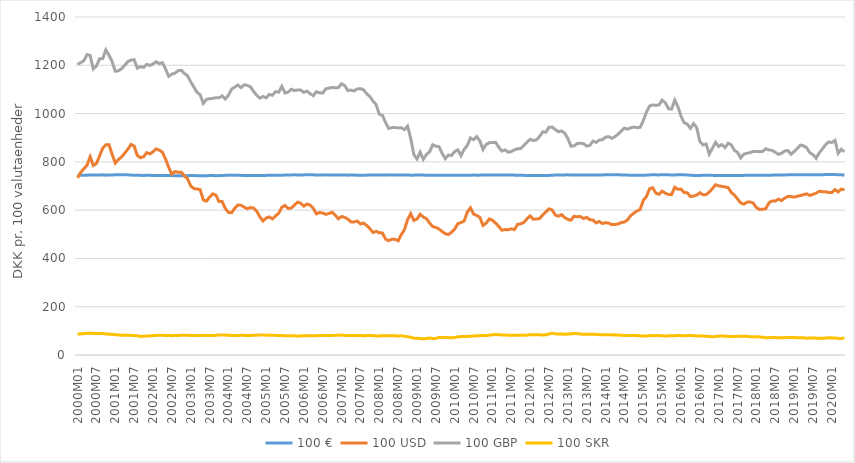
| Category | 100 € | 100 USD | 100 GBP | 100 SKR |
|---|---|---|---|---|
| 2000M01 | 744.399 | 733.583 | 1203.584 | 86.577 |
| 2000M02 | 744.528 | 756.235 | 1211.206 | 87.478 |
| 2000M03 | 744.74 | 771.574 | 1218.889 | 88.74 |
| 2000M04 | 745.025 | 785.645 | 1244.331 | 90.124 |
| 2000M05 | 745.682 | 820.972 | 1240.706 | 90.496 |
| 2000M06 | 746.01 | 785.108 | 1184.871 | 89.744 |
| 2000M07 | 745.88 | 793.219 | 1196.805 | 88.708 |
| 2000M08 | 745.776 | 824.039 | 1227.002 | 88.854 |
| 2000M09 | 746.231 | 856.511 | 1227.985 | 88.696 |
| 2000M10 | 744.733 | 870.721 | 1264.013 | 87.368 |
| 2000M11 | 745.671 | 870.685 | 1241.532 | 86.42 |
| 2000M12 | 745.78 | 831.13 | 1214.954 | 86.106 |
| 2001M01 | 746.437 | 795.062 | 1175.57 | 83.884 |
| 2001M02 | 746.312 | 809.493 | 1176.835 | 83.174 |
| 2001M03 | 746.439 | 820.677 | 1186.094 | 81.772 |
| 2001M04 | 746.324 | 835.922 | 1199.776 | 81.889 |
| 2001M05 | 746.163 | 852.52 | 1215.663 | 82.334 |
| 2001M06 | 745.373 | 872.19 | 1221.512 | 81.013 |
| 2001M07 | 744.489 | 865.706 | 1223.295 | 80.41 |
| 2001M08 | 744.517 | 826.772 | 1187.89 | 80.001 |
| 2001M09 | 744.138 | 817.05 | 1194.541 | 76.928 |
| 2001M10 | 743.669 | 820.787 | 1191.443 | 77.647 |
| 2001M11 | 744.527 | 838.099 | 1203.92 | 79.118 |
| 2001M12 | 744.327 | 833.059 | 1199.589 | 78.974 |
| 2002M01 | 743.287 | 841.677 | 1205.53 | 80.552 |
| 2002M02 | 742.988 | 853.996 | 1214.844 | 80.914 |
| 2002M03 | 743.232 | 848.49 | 1206.817 | 82.027 |
| 2002M04 | 743.41 | 839.81 | 1211 | 81.42 |
| 2002M05 | 743.538 | 811.306 | 1184.193 | 80.664 |
| 2002M06 | 743.298 | 777.475 | 1154.035 | 81.567 |
| 2002M07 | 743.01 | 748.969 | 1163.403 | 80.178 |
| 2002M08 | 742.698 | 759.618 | 1167.209 | 80.31 |
| 2002M09 | 742.71 | 757.302 | 1177.83 | 81.018 |
| 2002M10 | 742.97 | 757.296 | 1179.439 | 81.6 |
| 2002M11 | 742.795 | 741.821 | 1165.94 | 81.79 |
| 2002M12 | 742.623 | 729.936 | 1156.821 | 81.642 |
| 2003M01 | 743.243 | 699.871 | 1131.145 | 81.026 |
| 2003M02 | 743.166 | 689.86 | 1109.811 | 81.262 |
| 2003M03 | 742.739 | 687.471 | 1088.249 | 80.502 |
| 2003M04 | 742.555 | 684.89 | 1077.956 | 81.123 |
| 2003M05 | 742.462 | 642.658 | 1042.058 | 81.108 |
| 2003M06 | 742.505 | 637.227 | 1058.777 | 81.436 |
| 2003M07 | 743.318 | 653.704 | 1061.332 | 80.924 |
| 2003M08 | 743.22 | 667.438 | 1063.033 | 80.454 |
| 2003M09 | 742.729 | 662.166 | 1065.77 | 81.913 |
| 2003M10 | 743.011 | 635.512 | 1065.149 | 82.462 |
| 2003M11 | 743.704 | 635.692 | 1073.587 | 82.69 |
| 2003M12 | 744.17 | 607.03 | 1060.359 | 82.542 |
| 2004M01 | 744.811 | 590.553 | 1076.153 | 81.52 |
| 2004M02 | 745.112 | 589.249 | 1100.848 | 81.202 |
| 2004M03 | 744.93 | 607.564 | 1109.847 | 80.668 |
| 2004M04 | 744.346 | 621.429 | 1118.363 | 81.214 |
| 2004M05 | 744.057 | 620.236 | 1107.532 | 81.459 |
| 2004M06 | 743.422 | 612.493 | 1119.176 | 81.311 |
| 2004M07 | 743.549 | 606.257 | 1116.869 | 80.855 |
| 2004M08 | 743.65 | 610.809 | 1110.957 | 80.956 |
| 2004M09 | 743.809 | 608.822 | 1091.766 | 81.811 |
| 2004M10 | 743.785 | 595.651 | 1075.725 | 82.079 |
| 2004M11 | 743.133 | 572.11 | 1063.735 | 82.592 |
| 2004M12 | 743.322 | 555.131 | 1070.971 | 82.8 |
| 2005M01 | 744.049 | 567.197 | 1065.008 | 82.238 |
| 2005M02 | 744.268 | 571.964 | 1079.158 | 81.92 |
| 2005M03 | 744.642 | 563.706 | 1075.752 | 81.944 |
| 2005M04 | 744.992 | 576.149 | 1090.886 | 81.272 |
| 2005M05 | 744.436 | 586.974 | 1088.365 | 80.98 |
| 2005M06 | 744.485 | 612.025 | 1112.964 | 80.381 |
| 2005M07 | 745.842 | 619.649 | 1084.829 | 79.113 |
| 2005M08 | 745.963 | 606.87 | 1088.64 | 79.87 |
| 2005M09 | 745.843 | 608.649 | 1100.742 | 79.905 |
| 2005M10 | 746.196 | 621.098 | 1095.182 | 79.202 |
| 2005M11 | 745.96 | 632.986 | 1098.127 | 78.02 |
| 2005M12 | 745.414 | 628.759 | 1097.488 | 79.034 |
| 2006M01 | 746.125 | 616.522 | 1087.68 | 80.134 |
| 2006M02 | 746.41 | 625.24 | 1092.897 | 79.906 |
| 2006M03 | 746.116 | 620.76 | 1082.387 | 79.361 |
| 2006M04 | 746.173 | 607.624 | 1073.831 | 79.934 |
| 2006M05 | 745.656 | 584.532 | 1090.463 | 79.944 |
| 2006M06 | 745.647 | 590.165 | 1086.062 | 80.723 |
| 2006M07 | 746.016 | 588.2 | 1084.658 | 80.94 |
| 2006M08 | 746.093 | 582.378 | 1102.586 | 81.011 |
| 2006M09 | 746.011 | 586.156 | 1105.051 | 80.508 |
| 2006M10 | 745.553 | 591.213 | 1108.575 | 80.572 |
| 2006M11 | 745.643 | 578.93 | 1106.374 | 81.933 |
| 2006M12 | 745.494 | 564.235 | 1107.958 | 82.487 |
| 2007M01 | 745.39 | 573.467 | 1123.702 | 82.097 |
| 2007M02 | 745.41 | 570.164 | 1115.953 | 81.122 |
| 2007M03 | 744.941 | 562.589 | 1095.179 | 80.109 |
| 2007M04 | 745.29 | 551.112 | 1097.129 | 80.704 |
| 2007M05 | 745.176 | 551.244 | 1093.812 | 80.954 |
| 2007M06 | 744.508 | 555.082 | 1102.187 | 79.807 |
| 2007M07 | 744.099 | 542.539 | 1103.365 | 81.02 |
| 2007M08 | 744.29 | 546.404 | 1098.328 | 79.838 |
| 2007M09 | 745.064 | 536.252 | 1081.777 | 80.262 |
| 2007M10 | 745.344 | 523.904 | 1070.691 | 81.25 |
| 2007M11 | 745.432 | 507.696 | 1051.628 | 80.253 |
| 2007M12 | 745.989 | 511.994 | 1036.867 | 79.116 |
| 2008M01 | 745.046 | 506.244 | 997.096 | 78.998 |
| 2008M02 | 745.399 | 505.49 | 992.685 | 79.605 |
| 2008M03 | 745.592 | 480.117 | 962.553 | 79.306 |
| 2008M04 | 746.03 | 473.731 | 938.405 | 79.63 |
| 2008M05 | 746.087 | 479.42 | 941.78 | 80.124 |
| 2008M06 | 745.858 | 479.36 | 942.208 | 79.544 |
| 2008M07 | 745.989 | 473.072 | 940.646 | 78.886 |
| 2008M08 | 745.947 | 498.34 | 940.969 | 79.37 |
| 2008M09 | 745.832 | 519.167 | 933.27 | 77.993 |
| 2008M10 | 745.446 | 560.289 | 947.727 | 75.695 |
| 2008M11 | 744.848 | 585.068 | 897.169 | 73.565 |
| 2008M12 | 745.03 | 557.464 | 829.936 | 69.514 |
| 2009M01 | 745.194 | 563.162 | 811.979 | 69.484 |
| 2009M02 | 745.141 | 582.88 | 840.26 | 68.368 |
| 2009M03 | 745.088 | 571.456 | 810.435 | 66.703 |
| 2009M04 | 744.906 | 565.006 | 830.367 | 68.47 |
| 2009M05 | 744.689 | 546.991 | 841.444 | 70.227 |
| 2009M06 | 744.56 | 531.93 | 870.89 | 68.427 |
| 2009M07 | 744.576 | 528.563 | 864.88 | 68.802 |
| 2009M08 | 744.4 | 521.75 | 863.043 | 72.833 |
| 2009M09 | 744.28 | 511.191 | 835.287 | 72.99 |
| 2009M10 | 744.384 | 502.449 | 813.156 | 72.2 |
| 2009M11 | 744.148 | 498.968 | 827.865 | 72.021 |
| 2009M12 | 744.182 | 508.692 | 826.691 | 71.461 |
| 2010M01 | 744.242 | 521.552 | 842.986 | 73.011 |
| 2010M02 | 744.402 | 543.982 | 849.768 | 74.83 |
| 2010M03 | 744.165 | 548.494 | 825.418 | 76.501 |
| 2010M04 | 744.273 | 555.167 | 851.4 | 77.049 |
| 2010M05 | 744.155 | 591.902 | 868.222 | 76.967 |
| 2010M06 | 744.087 | 609.549 | 899.034 | 77.735 |
| 2010M07 | 745.217 | 583.719 | 891.825 | 78.486 |
| 2010M08 | 744.952 | 577.9 | 904.507 | 79.071 |
| 2010M09 | 744.757 | 570.258 | 886.916 | 80.744 |
| 2010M10 | 745.67 | 536.566 | 850.912 | 80.36 |
| 2010M11 | 745.47 | 545.986 | 871.927 | 80.018 |
| 2010M12 | 745.277 | 563.812 | 879.47 | 82.233 |
| 2011M01 | 745.184 | 558 | 879.819 | 83.617 |
| 2011M02 | 745.548 | 546.266 | 880.926 | 84.838 |
| 2011M03 | 745.743 | 532.755 | 860.719 | 83.927 |
| 2011M04 | 745.741 | 516.754 | 844.58 | 83.096 |
| 2011M05 | 745.662 | 519.646 | 849.467 | 83.24 |
| 2011M06 | 745.814 | 518.667 | 839.894 | 81.733 |
| 2011M07 | 745.598 | 522.764 | 842.795 | 81.631 |
| 2011M08 | 744.977 | 519.42 | 849.797 | 81.286 |
| 2011M09 | 744.624 | 540.935 | 854.226 | 81.53 |
| 2011M10 | 744.417 | 543.315 | 855.335 | 81.683 |
| 2011M11 | 744.121 | 549.013 | 867.897 | 81.43 |
| 2011M12 | 743.407 | 564.202 | 880.879 | 82.435 |
| 2012M01 | 743.531 | 576.24 | 893.578 | 84.016 |
| 2012M02 | 743.415 | 562.216 | 888.285 | 84.291 |
| 2012M03 | 743.54 | 563.271 | 891.03 | 83.664 |
| 2012M04 | 743.926 | 565.012 | 905.331 | 83.891 |
| 2012M05 | 743.375 | 580.206 | 924.261 | 82.793 |
| 2012M06 | 743.259 | 593.158 | 922.654 | 83.805 |
| 2012M07 | 743.838 | 605.391 | 943.736 | 87.063 |
| 2012M08 | 744.544 | 600.487 | 943.872 | 89.919 |
| 2012M09 | 745.39 | 579.906 | 933.856 | 87.77 |
| 2012M10 | 745.82 | 574.866 | 924.613 | 86.58 |
| 2012M11 | 745.865 | 581.482 | 927.848 | 86.654 |
| 2012M12 | 746.031 | 569.129 | 918.95 | 86.186 |
| 2013M01 | 746.143 | 561.59 | 896.363 | 86.546 |
| 2013M02 | 745.981 | 558.487 | 864.952 | 87.682 |
| 2013M03 | 745.532 | 574.745 | 866.263 | 89.324 |
| 2013M04 | 745.53 | 572.311 | 875.782 | 88.354 |
| 2013M05 | 745.369 | 573.733 | 877.152 | 86.948 |
| 2013M06 | 745.78 | 565.238 | 875.385 | 85.862 |
| 2013M07 | 745.793 | 570.24 | 865.29 | 86.115 |
| 2013M08 | 745.8 | 560.359 | 868.21 | 85.693 |
| 2013M09 | 745.794 | 558.798 | 886.056 | 85.966 |
| 2013M10 | 745.918 | 547.091 | 880.491 | 85.272 |
| 2013M11 | 745.866 | 552.797 | 890.285 | 83.998 |
| 2013M12 | 746.028 | 544.571 | 891.821 | 83.239 |
| 2014M01 | 746.142 | 548.228 | 902.528 | 84.466 |
| 2014M02 | 746.224 | 546.368 | 904.428 | 84.114 |
| 2014M03 | 746.384 | 539.989 | 897.459 | 84.181 |
| 2014M04 | 746.56 | 540.59 | 904.665 | 82.689 |
| 2014M05 | 746.41 | 542.699 | 914.922 | 82.687 |
| 2014M06 | 745.845 | 548.708 | 928.334 | 82.007 |
| 2014M07 | 745.645 | 550.754 | 940.168 | 80.764 |
| 2014M08 | 745.51 | 559.878 | 935.053 | 81.143 |
| 2014M09 | 744.488 | 577.124 | 941.12 | 80.986 |
| 2014M10 | 744.48 | 587.486 | 944.072 | 81.106 |
| 2014M11 | 744.154 | 596.656 | 941.382 | 80.55 |
| 2014M12 | 744 | 602.604 | 943.122 | 79.179 |
| 2015M01 | 744.06 | 640.538 | 970.65 | 79.019 |
| 2015M02 | 745.009 | 656.434 | 1006.182 | 78.508 |
| 2015M03 | 745.931 | 688.511 | 1031.034 | 80.691 |
| 2015M04 | 746.526 | 692.877 | 1036.009 | 80.062 |
| 2015M05 | 746.109 | 670.265 | 1033.897 | 80.272 |
| 2015M06 | 746.027 | 665.375 | 1035.906 | 80.491 |
| 2015M07 | 746.163 | 678.629 | 1055.703 | 79.501 |
| 2015M08 | 746.266 | 670.13 | 1045.112 | 78.43 |
| 2015M09 | 746.099 | 664.928 | 1020.298 | 79.439 |
| 2015M10 | 746.006 | 664.108 | 1018.07 | 79.801 |
| 2015M11 | 746.017 | 694.973 | 1055.871 | 80.105 |
| 2015M12 | 746.108 | 686.266 | 1029.091 | 80.657 |
| 2016M01 | 746.19 | 687.137 | 989.084 | 80.388 |
| 2016M02 | 746.278 | 672.843 | 962.368 | 79.307 |
| 2016M03 | 745.702 | 672.137 | 956.414 | 80.31 |
| 2016M04 | 744.282 | 656.171 | 939.038 | 80.85 |
| 2016M05 | 743.855 | 658.509 | 958.658 | 80.025 |
| 2016M06 | 743.706 | 662.38 | 941.43 | 79.683 |
| 2016M07 | 743.902 | 672.103 | 884.537 | 78.52 |
| 2016M08 | 744.08 | 663.693 | 870.134 | 78.397 |
| 2016M09 | 744.745 | 664.243 | 873.942 | 77.858 |
| 2016M10 | 744.023 | 674.855 | 832.418 | 76.65 |
| 2016M11 | 744.056 | 689.238 | 856.624 | 75.536 |
| 2016M12 | 743.62 | 705.424 | 880.683 | 76.592 |
| 2017M01 | 743.547 | 700.574 | 863.675 | 78.178 |
| 2017M02 | 743.48 | 698.621 | 871.912 | 78.458 |
| 2017M03 | 743.557 | 695.981 | 859.036 | 78.04 |
| 2017M04 | 743.758 | 693.354 | 876.848 | 77.517 |
| 2017M05 | 743.985 | 673.294 | 870.608 | 76.623 |
| 2017M06 | 743.746 | 662.404 | 847.58 | 76.249 |
| 2017M07 | 743.664 | 646.125 | 839.229 | 77.554 |
| 2017M08 | 743.787 | 629.995 | 816.348 | 77.897 |
| 2017M09 | 744.013 | 624.485 | 831.84 | 78.044 |
| 2017M10 | 744.291 | 633.142 | 835.642 | 77.421 |
| 2017M11 | 744.196 | 634.062 | 838.149 | 75.574 |
| 2017M12 | 744.332 | 628.877 | 843.305 | 74.907 |
| 2018M01 | 744.546 | 610.418 | 842.941 | 75.82 |
| 2018M02 | 744.574 | 603.029 | 842.334 | 74.924 |
| 2018M03 | 744.88 | 603.795 | 843.384 | 73.358 |
| 2018M04 | 744.776 | 606.17 | 854.256 | 71.865 |
| 2018M05 | 744.807 | 630.993 | 849.168 | 71.96 |
| 2018M06 | 744.969 | 637.938 | 847.426 | 72.472 |
| 2018M07 | 745.226 | 637.732 | 839.939 | 72.3 |
| 2018M08 | 745.583 | 645.646 | 831.338 | 71.242 |
| 2018M09 | 745.832 | 639.745 | 835.404 | 71.426 |
| 2018M10 | 745.974 | 649.607 | 845.116 | 71.841 |
| 2018M11 | 746.113 | 656.41 | 846.776 | 72.496 |
| 2018M12 | 746.515 | 656.059 | 831.543 | 72.662 |
| 2019M01 | 746.574 | 653.963 | 842.78 | 72.707 |
| 2019M02 | 746.265 | 657.452 | 855.24 | 71.086 |
| 2019M03 | 746.248 | 660.264 | 869.547 | 71.075 |
| 2019M04 | 746.49 | 664.294 | 866.377 | 71.219 |
| 2019M05 | 746.742 | 667.352 | 858.232 | 69.489 |
| 2019M06 | 746.681 | 661.094 | 837.794 | 70.274 |
| 2019M07 | 746.556 | 665.496 | 830.08 | 70.695 |
| 2019M08 | 746.02 | 670.523 | 814.9 | 69.491 |
| 2019M09 | 746.343 | 678.268 | 837.789 | 69.773 |
| 2019M10 | 746.932 | 675.831 | 853.484 | 69.148 |
| 2019M11 | 747.201 | 676.154 | 871.274 | 70.163 |
| 2019M12 | 747.208 | 672.647 | 882.573 | 71.257 |
| 2020M01 | 747.291 | 673.23 | 879.946 | 70.804 |
| 2020M02 | 747.134 | 685.172 | 888.506 | 70.701 |
| 2020M03 | 747.032 | 675.453 | 835.516 | 68.714 |
| 2020M04 | 746.144 | 686.968 | 852.307 | 68.574 |
| 2020M05 | 745.767 | 684.278 | 841.558 | 70.325 |